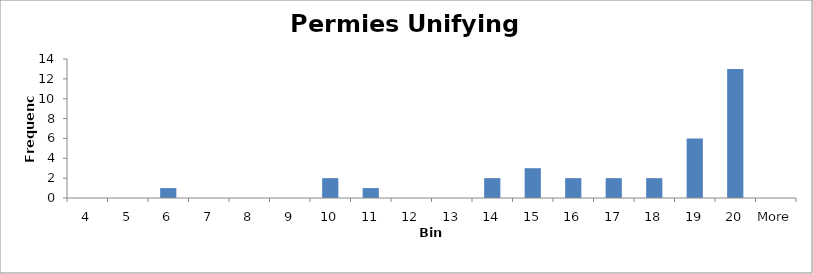
| Category | Frequency |
|---|---|
| 4 | 0 |
| 5 | 0 |
| 6 | 1 |
| 7 | 0 |
| 8 | 0 |
| 9 | 0 |
| 10 | 2 |
| 11 | 1 |
| 12 | 0 |
| 13 | 0 |
| 14 | 2 |
| 15 | 3 |
| 16 | 2 |
| 17 | 2 |
| 18 | 2 |
| 19 | 6 |
| 20 | 13 |
| More | 0 |